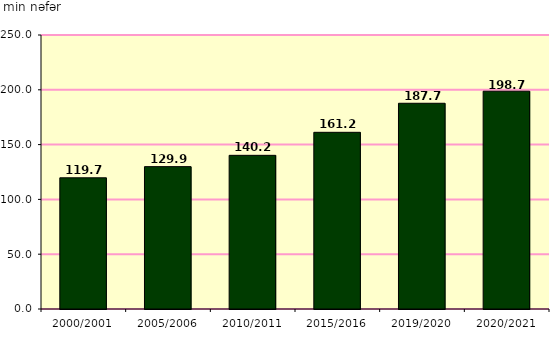
| Category | сцьш, min nцfцr |
|---|---|
| 2000/2001 | 119.7 |
| 2005/2006 | 129.9 |
| 2010/2011 | 140.2 |
| 2015/2016 | 161.2 |
| 2019/2020 | 187.7 |
| 2020/2021 | 198.7 |